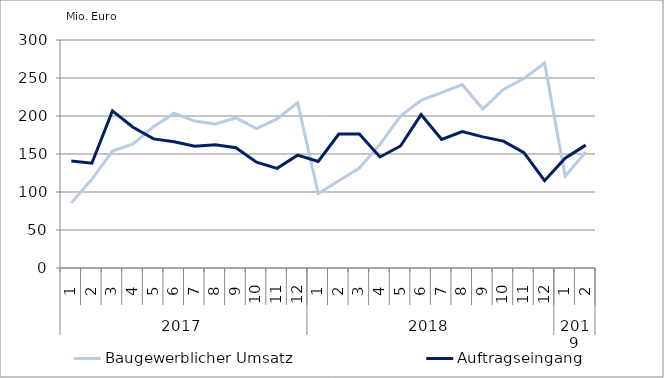
| Category | Baugewerblicher Umsatz | Auftragseingang |
|---|---|---|
| 0 | 85701.947 | 140751.008 |
| 1 | 116743.276 | 137863.383 |
| 2 | 153810.055 | 206710.579 |
| 3 | 163342.989 | 185183.797 |
| 4 | 185946.221 | 169878.51 |
| 5 | 203627.91 | 166148.392 |
| 6 | 193377.256 | 160134.206 |
| 7 | 189429.952 | 162221.206 |
| 8 | 197405.279 | 158305.285 |
| 9 | 183450.026 | 139156.761 |
| 10 | 196209.214 | 131165.419 |
| 11 | 217688.447 | 148434.901 |
| 12 | 97959.056 | 140119.385 |
| 13 | 114756.787 | 176330.213 |
| 14 | 131454.642 | 176241.061 |
| 15 | 162648.053 | 146063.407 |
| 16 | 199809.407 | 160551.931 |
| 17 | 220535.974 | 201835.846 |
| 18 | 230672.472 | 169132.23 |
| 19 | 241233.619 | 179396.293 |
| 20 | 209099.292 | 172542.764 |
| 21 | 234953.007 | 166991.729 |
| 22 | 249410.043 | 151835.629 |
| 23 | 269773.227 | 114807.456 |
| 24 | 120975.133 | 144510.881 |
| 25 | 152329.786 | 161685.201 |